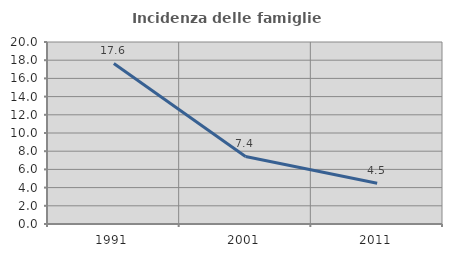
| Category | Incidenza delle famiglie numerose |
|---|---|
| 1991.0 | 17.638 |
| 2001.0 | 7.425 |
| 2011.0 | 4.469 |